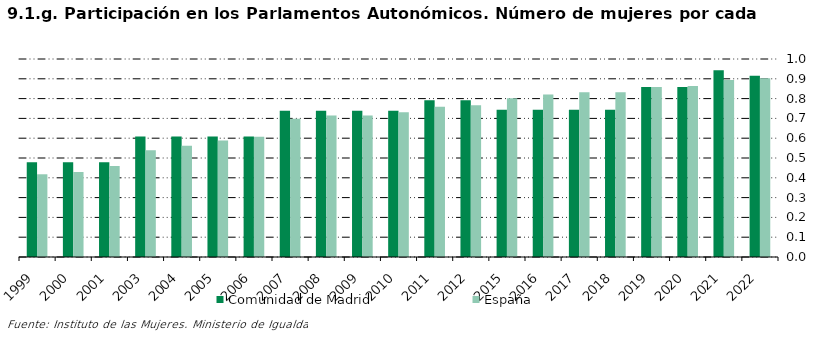
| Category | Comunidad de Madrid | España |
|---|---|---|
| 1999.0 | 0.478 | 0.418 |
| 2000.0 | 0.478 | 0.43 |
| 2001.0 | 0.478 | 0.46 |
| 2003.0 | 0.609 | 0.539 |
| 2004.0 | 0.609 | 0.562 |
| 2005.0 | 0.609 | 0.588 |
| 2006.0 | 0.609 | 0.607 |
| 2007.0 | 0.739 | 0.698 |
| 2008.0 | 0.739 | 0.714 |
| 2009.0 | 0.739 | 0.714 |
| 2010.0 | 0.739 | 0.731 |
| 2011.0 | 0.792 | 0.759 |
| 2012.0 | 0.792 | 0.766 |
| 2015.0 | 0.743 | 0.802 |
| 2016.0 | 0.743 | 0.821 |
| 2017.0 | 0.743 | 0.833 |
| 2018.0 | 0.743 | 0.833 |
| 2019.0 | 0.859 | 0.858 |
| 2020.0 | 0.859 | 0.864 |
| 2021.0 | 0.943 | 0.893 |
| 2022.0 | 0.915 | 0.902 |